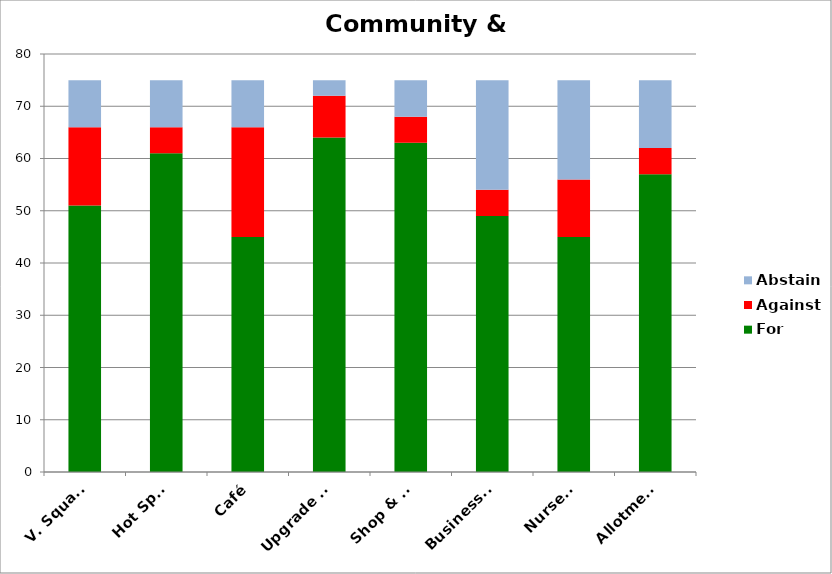
| Category | For | Against | Abstain |
|---|---|---|---|
| V. Square | 51 | 15 | 9 |
| Hot Spot | 61 | 5 | 9 |
| Café | 45 | 21 | 9 |
| Upgrade VH | 64 | 8 | 3 |
| Shop & PO | 63 | 5 | 7 |
| Businesses | 49 | 5 | 21 |
| Nursery | 45 | 11 | 19 |
| Allotments | 57 | 5 | 13 |